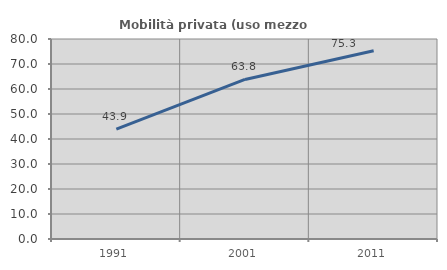
| Category | Mobilità privata (uso mezzo privato) |
|---|---|
| 1991.0 | 43.915 |
| 2001.0 | 63.834 |
| 2011.0 | 75.28 |